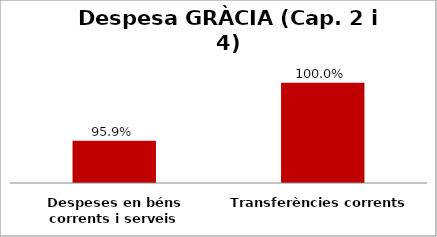
| Category | Series 0 |
|---|---|
| Despeses en béns corrents i serveis | 0.959 |
| Transferències corrents | 1 |